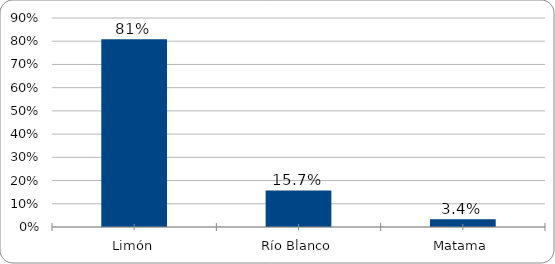
| Category | Series 0 |
|---|---|
| Limón | 0.809 |
| Río Blanco | 0.157 |
| Matama | 0.034 |